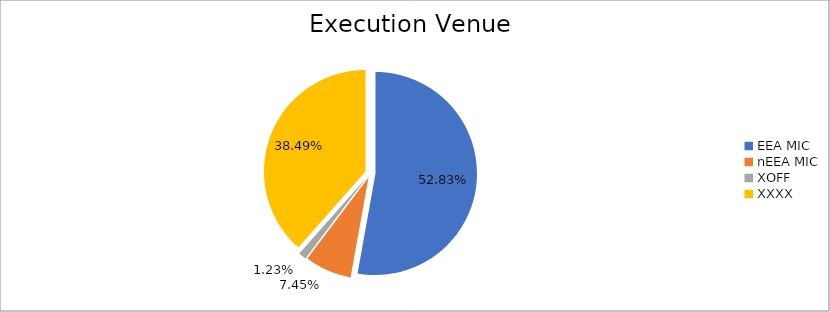
| Category | Series 0 |
|---|---|
| EEA MIC | 6890488.239 |
| nEEA MIC | 971667.495 |
| XOFF | 160870.893 |
| XXXX | 5020426.117 |